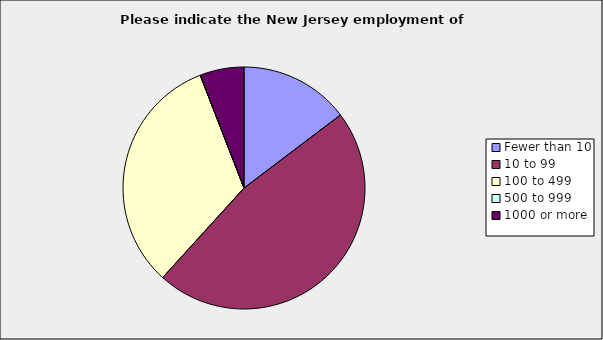
| Category | Series 0 |
|---|---|
| Fewer than 10 | 0.147 |
| 10 to 99 | 0.471 |
| 100 to 499 | 0.324 |
| 500 to 999 | 0 |
| 1000 or more | 0.059 |